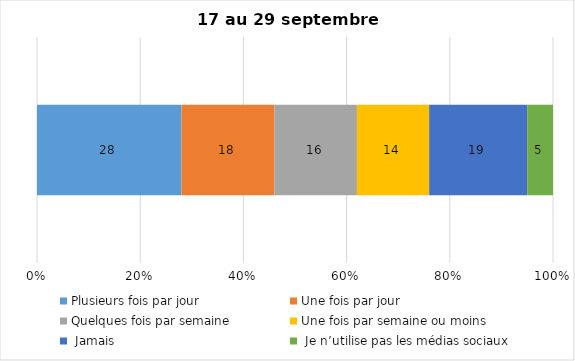
| Category | Plusieurs fois par jour | Une fois par jour | Quelques fois par semaine   | Une fois par semaine ou moins   |  Jamais   |  Je n’utilise pas les médias sociaux |
|---|---|---|---|---|---|---|
| 0 | 28 | 18 | 16 | 14 | 19 | 5 |